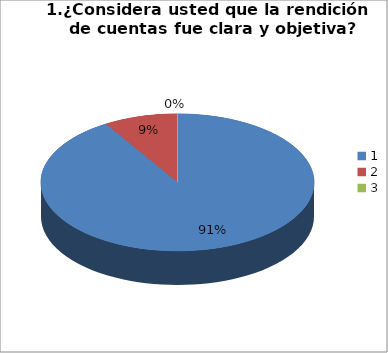
| Category | Series 0 |
|---|---|
| 0 | 52 |
| 1 | 5 |
| 2 | 0 |